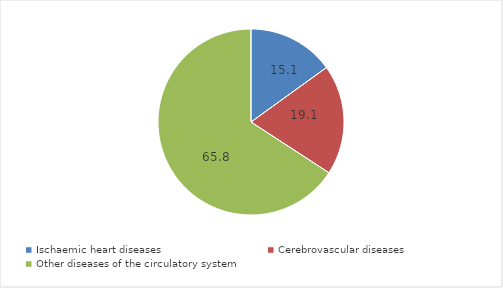
| Category | Series 0 |
|---|---|
| Ischaemic heart diseases | 15.051 |
| Cerebrovascular diseases | 19.13 |
| Other diseases of the circulatory system | 65.82 |